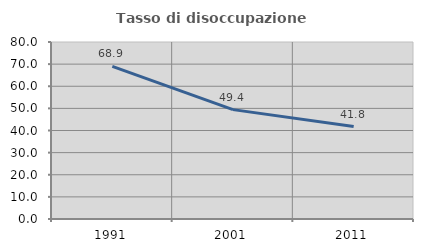
| Category | Tasso di disoccupazione giovanile  |
|---|---|
| 1991.0 | 68.945 |
| 2001.0 | 49.434 |
| 2011.0 | 41.808 |